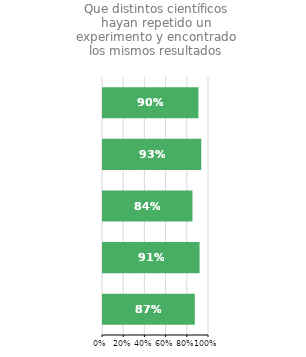
| Category | Que distintos científicos hayan repetido un experimento y encontrado los |
|---|---|
| Turquía | 0.866 |
| Israel | 0.911 |
| Estados Unidos | 0.844 |
| España | 0.927 |
| Total Europa | 0.9 |